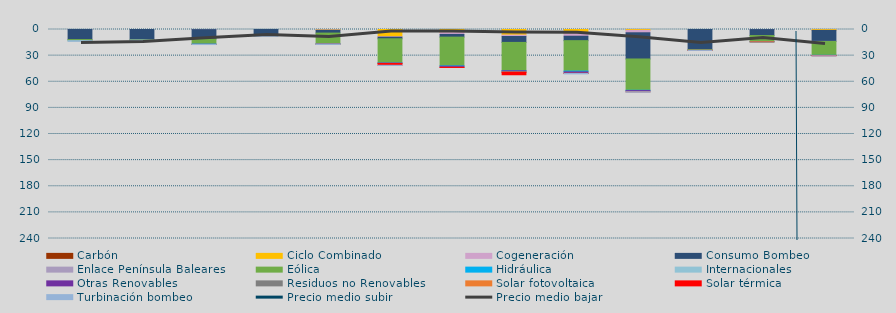
| Category | Carbón | Ciclo Combinado | Cogeneración | Consumo Bombeo | Enlace Península Baleares | Eólica | Hidráulica | Internacionales | Otras Renovables | Residuos no Renovables | Solar fotovoltaica | Solar térmica | Turbinación bombeo |
|---|---|---|---|---|---|---|---|---|---|---|---|---|---|
| 0 |  | 0 | 13.8 | 11574.5 | 0 | 1255.7 | 0 | 313 | 0 | 0 | 0 | 0 | 240.1 |
| 1 |  | 0 | 0 | 11798.2 | 0 | 360.9 | 0 | 0 | 0 | 0 | 0 | 0 | 358.6 |
| 2 |  | 0 | 132.9 | 10732.4 | 0 | 5808.3 | 350.7 | 0 | 98.7 | 0 | 2.1 | 0 | 152.1 |
| 3 |  | 0 | 0 | 6311.1 | 0 | 429.6 | 2 | 0 | 0 | 0 | 0 | 0 | 1049.5 |
| 4 |  | 520 | 398.7 | 3208 | 0 | 12396.3 | 41.7 | 0 | 256.7 | 0 | 0.8 | 0 | 340.4 |
| 5 |  | 8320.6 | 532.5 | 1797.8 | 0 | 27746.3 | 146.7 | 0 | 300.2 | 0 | 250.5 | 1972.6 | 219.1 |
| 6 |  | 3526.6 | 2136.1 | 3089.7 | 0 | 32962.8 | 457 | 0 | 1325.6 | 0 | 38.1 | 15 | 0 |
| 7 |  | 6424.4 | 1632 | 6769.5 | 0 | 32546.8 | 161.3 | 0 | 1318.2 | 30.1 | 404.6 | 2687.6 | 0 |
| 8 |  | 4734 | 2991.4 | 5082.6 | 0 | 34919.2 | 974.6 | 0 | 1593 | 0 | 127.6 | 75.4 | 456.5 |
| 9 |  | 1002.5 | 2760.3 | 30103.8 | 0 | 35894 | 414.2 | 0 | 1401.5 | 0 | 44.9 | 0 | 291.7 |
| 10 |  | 0 | 0 | 23016.4 | 0 | 876.3 | 57 | 0 | 0 | 0 | 2.3 | 24.4 | 80 |
| 11 |  | 0 | 75.3 | 6919 | 0 | 7092 | 5.4 | 0 | 35 | 0 | 9.9 | 0 | 0 |
| 12 |  | 961.7 | 104.4 | 12588.9 | 171.2 | 15813.4 | 165.3 | 0 | 58 | 0 | 94.9 | 202.5 | 300 |